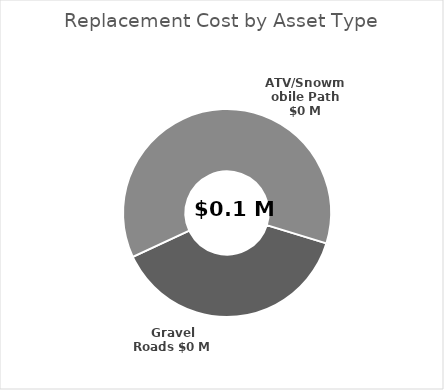
| Category | Series 1 |
|---|---|
| Gravel Roads | 23000 |
| Sidewalks | 0 |
| ATV/Snowmobile Path | 37000 |
| Street Lights | 0 |
| Ditches | 0 |
| Stormwater Ponds | 0 |
| Stormwater Ponds | 0 |